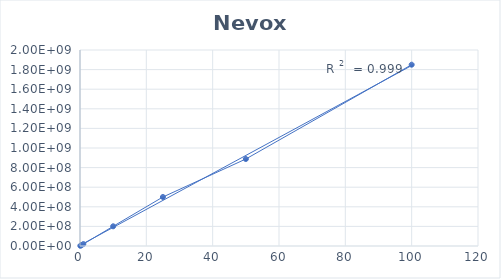
| Category | Series 0 |
|---|---|
| 0.1 | 1980000 |
| 0.5 | 9891000 |
| 1.0 | 19350000 |
| 10.0 | 201000000 |
| 25.0 | 500000000 |
| 50.0 | 887700000 |
| 100.0 | 1850000000 |